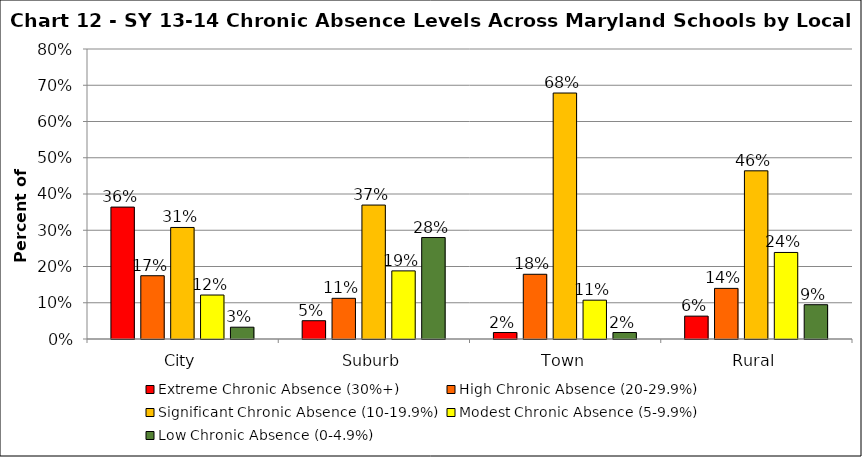
| Category | Extreme Chronic Absence (30%+) | High Chronic Absence (20-29.9%) | Significant Chronic Absence (10-19.9%) | Modest Chronic Absence (5-9.9%) | Low Chronic Absence (0-4.9%) |
|---|---|---|---|---|---|
| 0 | 0.364 | 0.175 | 0.308 | 0.121 | 0.033 |
| 1 | 0.05 | 0.112 | 0.369 | 0.188 | 0.28 |
| 2 | 0.018 | 0.179 | 0.679 | 0.107 | 0.018 |
| 3 | 0.063 | 0.14 | 0.464 | 0.239 | 0.095 |